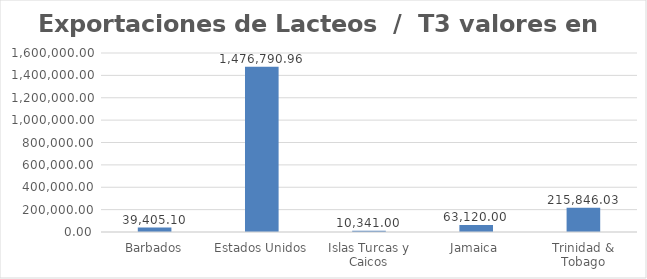
| Category | Valor US  |
|---|---|
| Barbados | 39405.1 |
| Estados Unidos | 1476790.96 |
| Islas Turcas y Caicos | 10341 |
| Jamaica | 63120 |
| Trinidad & Tobago | 215846.03 |